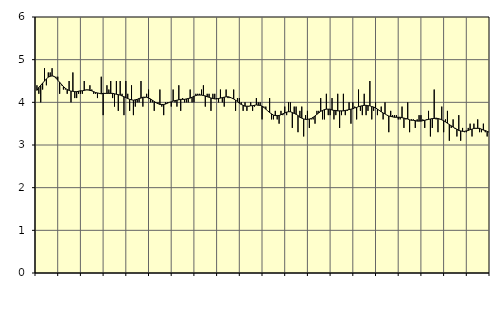
| Category | Jordbruk, skogsbruk o fiske, SNI 01-03 | Series 1 |
|---|---|---|
| nan | 4.4 | 4.28 |
| 1.0 | 4.2 | 4.35 |
| 1.0 | 4 | 4.4 |
| 1.0 | 4.3 | 4.45 |
| 1.0 | 4.8 | 4.5 |
| 1.0 | 4.4 | 4.55 |
| 1.0 | 4.7 | 4.59 |
| 1.0 | 4.7 | 4.61 |
| 1.0 | 4.8 | 4.62 |
| 1.0 | 4.6 | 4.61 |
| 1.0 | 4.6 | 4.57 |
| 1.0 | 4.6 | 4.52 |
| nan | 4.2 | 4.47 |
| 2.0 | 4.4 | 4.42 |
| 2.0 | 4.3 | 4.37 |
| 2.0 | 4.3 | 4.33 |
| 2.0 | 4.2 | 4.3 |
| 2.0 | 4.5 | 4.28 |
| 2.0 | 4 | 4.26 |
| 2.0 | 4.7 | 4.26 |
| 2.0 | 4.1 | 4.25 |
| 2.0 | 4.1 | 4.25 |
| 2.0 | 4.2 | 4.26 |
| 2.0 | 4.2 | 4.27 |
| nan | 4.2 | 4.27 |
| 3.0 | 4.5 | 4.28 |
| 3.0 | 4.3 | 4.29 |
| 3.0 | 4.3 | 4.29 |
| 3.0 | 4.4 | 4.28 |
| 3.0 | 4.3 | 4.27 |
| 3.0 | 4.2 | 4.25 |
| 3.0 | 4.2 | 4.23 |
| 3.0 | 4.1 | 4.22 |
| 3.0 | 4.2 | 4.21 |
| 3.0 | 4.6 | 4.2 |
| 3.0 | 3.7 | 4.21 |
| nan | 4.2 | 4.21 |
| 4.0 | 4.4 | 4.21 |
| 4.0 | 4.3 | 4.21 |
| 4.0 | 4.5 | 4.21 |
| 4.0 | 4.1 | 4.21 |
| 4.0 | 3.9 | 4.2 |
| 4.0 | 4.5 | 4.19 |
| 4.0 | 3.8 | 4.18 |
| 4.0 | 4.5 | 4.17 |
| 4.0 | 4.2 | 4.15 |
| 4.0 | 3.7 | 4.13 |
| 4.0 | 4.5 | 4.11 |
| nan | 4.2 | 4.09 |
| 5.0 | 3.8 | 4.07 |
| 5.0 | 4.4 | 4.06 |
| 5.0 | 3.7 | 4.05 |
| 5.0 | 3.9 | 4.06 |
| 5.0 | 4 | 4.07 |
| 5.0 | 4 | 4.09 |
| 5.0 | 4.5 | 4.1 |
| 5.0 | 3.9 | 4.12 |
| 5.0 | 4.1 | 4.12 |
| 5.0 | 4.2 | 4.12 |
| 5.0 | 4.3 | 4.1 |
| nan | 4 | 4.08 |
| 6.0 | 4 | 4.05 |
| 6.0 | 3.8 | 4.02 |
| 6.0 | 4 | 3.99 |
| 6.0 | 4 | 3.97 |
| 6.0 | 4.3 | 3.95 |
| 6.0 | 3.9 | 3.95 |
| 6.0 | 3.7 | 3.95 |
| 6.0 | 4 | 3.96 |
| 6.0 | 4 | 3.98 |
| 6.0 | 4 | 4 |
| 6.0 | 3.9 | 4.01 |
| nan | 4.3 | 4.03 |
| 7.0 | 4 | 4.04 |
| 7.0 | 3.9 | 4.05 |
| 7.0 | 4.4 | 4.06 |
| 7.0 | 3.8 | 4.07 |
| 7.0 | 4.1 | 4.07 |
| 7.0 | 4 | 4.07 |
| 7.0 | 4 | 4.08 |
| 7.0 | 4 | 4.09 |
| 7.0 | 4.3 | 4.1 |
| 7.0 | 4 | 4.12 |
| 7.0 | 4 | 4.14 |
| nan | 4.2 | 4.16 |
| 8.0 | 4.2 | 4.17 |
| 8.0 | 4.2 | 4.17 |
| 8.0 | 4.3 | 4.17 |
| 8.0 | 4.4 | 4.16 |
| 8.0 | 3.9 | 4.15 |
| 8.0 | 4.2 | 4.13 |
| 8.0 | 4.2 | 4.12 |
| 8.0 | 3.8 | 4.1 |
| 8.0 | 4.2 | 4.09 |
| 8.0 | 4.2 | 4.08 |
| 8.0 | 4.1 | 4.08 |
| nan | 4 | 4.09 |
| 9.0 | 4.3 | 4.1 |
| 9.0 | 4 | 4.11 |
| 9.0 | 3.9 | 4.12 |
| 9.0 | 4.3 | 4.13 |
| 9.0 | 4.1 | 4.13 |
| 9.0 | 4.1 | 4.12 |
| 9.0 | 4.1 | 4.1 |
| 9.0 | 4.3 | 4.08 |
| 9.0 | 3.8 | 4.05 |
| 9.0 | 4.1 | 4.02 |
| 9.0 | 4.1 | 3.98 |
| nan | 4 | 3.95 |
| 10.0 | 3.8 | 3.93 |
| 10.0 | 4 | 3.91 |
| 10.0 | 3.8 | 3.91 |
| 10.0 | 3.9 | 3.91 |
| 10.0 | 4 | 3.92 |
| 10.0 | 3.8 | 3.92 |
| 10.0 | 3.9 | 3.93 |
| 10.0 | 4.1 | 3.94 |
| 10.0 | 4 | 3.93 |
| 10.0 | 4 | 3.93 |
| 10.0 | 3.6 | 3.91 |
| nan | 3.9 | 3.88 |
| 11.0 | 3.9 | 3.84 |
| 11.0 | 3.8 | 3.8 |
| 11.0 | 4.1 | 3.76 |
| 11.0 | 3.6 | 3.73 |
| 11.0 | 3.6 | 3.7 |
| 11.0 | 3.8 | 3.69 |
| 11.0 | 3.6 | 3.69 |
| 11.0 | 3.5 | 3.69 |
| 11.0 | 3.8 | 3.71 |
| 11.0 | 3.7 | 3.73 |
| 11.0 | 3.9 | 3.75 |
| nan | 3.7 | 3.77 |
| 12.0 | 4 | 3.78 |
| 12.0 | 4 | 3.78 |
| 12.0 | 3.4 | 3.76 |
| 12.0 | 3.9 | 3.74 |
| 12.0 | 3.9 | 3.72 |
| 12.0 | 3.3 | 3.69 |
| 12.0 | 3.8 | 3.65 |
| 12.0 | 3.9 | 3.63 |
| 12.0 | 3.2 | 3.61 |
| 12.0 | 3.7 | 3.6 |
| 12.0 | 3.8 | 3.6 |
| nan | 3.4 | 3.61 |
| 13.0 | 3.6 | 3.62 |
| 13.0 | 3.6 | 3.65 |
| 13.0 | 3.5 | 3.68 |
| 13.0 | 3.8 | 3.72 |
| 13.0 | 3.8 | 3.75 |
| 13.0 | 4.1 | 3.79 |
| 13.0 | 3.6 | 3.81 |
| 13.0 | 3.6 | 3.83 |
| 13.0 | 4.2 | 3.84 |
| 13.0 | 3.7 | 3.84 |
| 13.0 | 3.7 | 3.84 |
| nan | 4.1 | 3.82 |
| 14.0 | 3.6 | 3.81 |
| 14.0 | 3.7 | 3.81 |
| 14.0 | 4.2 | 3.8 |
| 14.0 | 3.4 | 3.8 |
| 14.0 | 3.7 | 3.8 |
| 14.0 | 4.2 | 3.8 |
| 14.0 | 3.7 | 3.81 |
| 14.0 | 3.8 | 3.82 |
| 14.0 | 4 | 3.83 |
| 14.0 | 3.5 | 3.84 |
| 14.0 | 4 | 3.85 |
| nan | 3.9 | 3.87 |
| 15.0 | 3.6 | 3.88 |
| 15.0 | 4.3 | 3.9 |
| 15.0 | 3.8 | 3.91 |
| 15.0 | 3.7 | 3.92 |
| 15.0 | 4.2 | 3.93 |
| 15.0 | 3.7 | 3.93 |
| 15.0 | 3.8 | 3.92 |
| 15.0 | 4.5 | 3.92 |
| 15.0 | 3.6 | 3.9 |
| 15.0 | 3.8 | 3.89 |
| 15.0 | 4 | 3.87 |
| nan | 3.7 | 3.84 |
| 16.0 | 3.8 | 3.81 |
| 16.0 | 3.9 | 3.78 |
| 16.0 | 3.6 | 3.75 |
| 16.0 | 4 | 3.73 |
| 16.0 | 3.7 | 3.7 |
| 16.0 | 3.3 | 3.68 |
| 16.0 | 3.8 | 3.67 |
| 16.0 | 3.7 | 3.66 |
| 16.0 | 3.7 | 3.65 |
| 16.0 | 3.7 | 3.65 |
| 16.0 | 3.6 | 3.65 |
| nan | 3.6 | 3.65 |
| 17.0 | 3.9 | 3.64 |
| 17.0 | 3.4 | 3.63 |
| 17.0 | 3.6 | 3.62 |
| 17.0 | 4 | 3.61 |
| 17.0 | 3.3 | 3.59 |
| 17.0 | 3.6 | 3.58 |
| 17.0 | 3.6 | 3.58 |
| 17.0 | 3.4 | 3.57 |
| 17.0 | 3.6 | 3.56 |
| 17.0 | 3.7 | 3.56 |
| 17.0 | 3.7 | 3.56 |
| nan | 3.6 | 3.57 |
| 18.0 | 3.4 | 3.58 |
| 18.0 | 3.6 | 3.59 |
| 18.0 | 3.8 | 3.6 |
| 18.0 | 3.2 | 3.61 |
| 18.0 | 3.4 | 3.62 |
| 18.0 | 4.3 | 3.62 |
| 18.0 | 3.6 | 3.63 |
| 18.0 | 3.3 | 3.62 |
| 18.0 | 3.6 | 3.61 |
| 18.0 | 3.9 | 3.59 |
| 18.0 | 3.3 | 3.57 |
| nan | 3.6 | 3.54 |
| 19.0 | 3.8 | 3.51 |
| 19.0 | 3.1 | 3.48 |
| 19.0 | 3.4 | 3.45 |
| 19.0 | 3.6 | 3.42 |
| 19.0 | 3.4 | 3.39 |
| 19.0 | 3.2 | 3.37 |
| 19.0 | 3.7 | 3.34 |
| 19.0 | 3.1 | 3.33 |
| 19.0 | 3.4 | 3.32 |
| 19.0 | 3.3 | 3.32 |
| 19.0 | 3.3 | 3.33 |
| nan | 3.4 | 3.34 |
| 20.0 | 3.5 | 3.36 |
| 20.0 | 3.2 | 3.37 |
| 20.0 | 3.5 | 3.39 |
| 20.0 | 3.4 | 3.39 |
| 20.0 | 3.6 | 3.39 |
| 20.0 | 3.3 | 3.39 |
| 20.0 | 3.3 | 3.37 |
| 20.0 | 3.5 | 3.35 |
| 20.0 | 3.3 | 3.34 |
| 20.0 | 3.2 | 3.32 |
| 20.0 | 3.3 | 3.3 |